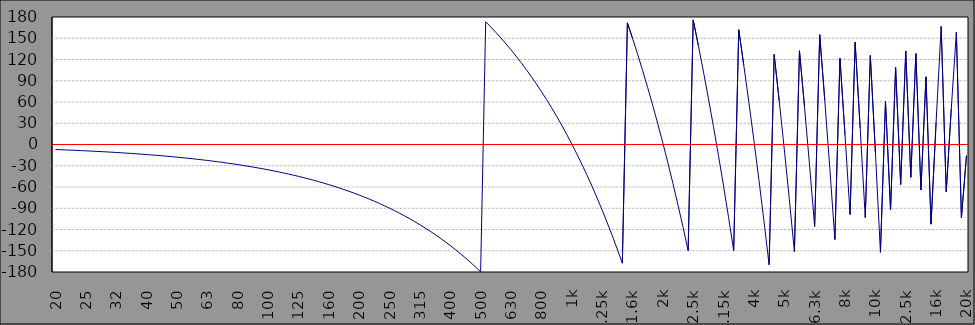
| Category | Series 0 |
|---|---|
| 20 | -7.1 |
| 20.78431373 | -7.378 |
| 21.59938485 | -7.668 |
| 22.44641955 | -7.969 |
| 23.3266713 | -8.281 |
| 24.24144272 | -8.606 |
| 25 | -8.943 |
| 26.18001254 | -9.294 |
| 27.2066797 | -9.658 |
| 28.27360831 | -10.037 |
| 29.38237726 | -10.431 |
| 30.53462735 | -10.84 |
| 31.5 | -11.265 |
| 32.97645838 | -11.707 |
| 34.26965282 | -12.166 |
| 35.61356077 | -12.643 |
| 37.010171 | -13.139 |
| 38.46155026 | -13.654 |
| 40 | -14.189 |
| 41.5372913 | -14.746 |
| 43.16620468 | -15.324 |
| 44.85899702 | -15.925 |
| 46.61817338 | -16.55 |
| 48.44633704 | -17.199 |
| 50 | -17.873 |
| 52.32055392 | -18.574 |
| 54.37234035 | -19.302 |
| 56.50458899 | -20.059 |
| 58.72045522 | -20.846 |
| 61.02321817 | -21.663 |
| 63 | -22.513 |
| 65.90319871 | -23.396 |
| 68.48763788 | -24.313 |
| 71.1734276 | -25.267 |
| 73.96454241 | -26.258 |
| 76.8651127 | -27.287 |
| 80 | -28.357 |
| 83.01195754 | -29.469 |
| 86.26732843 | -30.625 |
| 89.65036091 | -31.826 |
| 93.16606134 | -33.074 |
| 96.81963237 | -34.371 |
| 100 | -35.719 |
| 104.562225 | -37.12 |
| 108.6627045 | -38.576 |
| 112.923987 | -40.088 |
| 117.3523786 | -41.66 |
| 121.9544327 | -43.294 |
| 125 | -44.992 |
| 131.7070363 | -46.756 |
| 136.8720181 | -48.59 |
| 142.2395482 | -50.495 |
| 147.8175697 | -52.476 |
| 153.6143372 | -54.533 |
| 160 | -56.672 |
| 165.8987594 | -58.894 |
| 172.4045931 | -61.204 |
| 179.1655575 | -63.604 |
| 186.1916578 | -66.098 |
| 193.4932915 | -68.691 |
| 200 | -71.384 |
| 208.9668034 | -74.184 |
| 217.16158 | -77.093 |
| 225.6777204 | -80.116 |
| 234.5278271 | -83.258 |
| 243.7249968 | -86.523 |
| 250 | -89.916 |
| 263.2155002 | -93.442 |
| 273.5376767 | -97.107 |
| 284.2646444 | -100.915 |
| 295.4122775 | -104.872 |
| 306.9970727 | -108.985 |
| 315 | -113.259 |
| 331.5473961 | -117.7 |
| 344.5492547 | -122.316 |
| 358.0609902 | -127.112 |
| 372.1025977 | -132.097 |
| 386.6948564 | -137.278 |
| 400 | -142.661 |
| 417.6185512 | -148.256 |
| 433.9957493 | -154.07 |
| 451.0151904 | -160.111 |
| 468.7020606 | -166.39 |
| 487.0825336 | -172.915 |
| 500 | -179.696 |
| 526.0341549 | 173.257 |
| 546.6629453 | 165.933 |
| 568.1007079 | 158.323 |
| 590.379167 | 150.414 |
| 613.5312912 | 142.195 |
| 630 | 133.654 |
| 662.5949239 | 124.777 |
| 688.5790385 | 115.553 |
| 715.5821381 | 105.967 |
| 743.6441827 | 96.005 |
| 772.8066997 | 85.652 |
| 800 | 74.893 |
| 834.6074661 | 63.712 |
| 867.3371707 | 52.093 |
| 901.350393 | 40.018 |
| 936.6974673 | 27.47 |
| 973.4307013 | 14.43 |
| 1k | 0.878 |
| 1051.275217 | -13.205 |
| 1092.501696 | -27.841 |
| 1135.3449 | -43.05 |
| 1179.868229 | -58.856 |
| 1226.137572 | -75.282 |
| 1.25k | -92.352 |
| 1324.190865 | -110.091 |
| 1376.119918 | -128.526 |
| 1430.085405 | -147.684 |
| 1486.167186 | -167.593 |
| 1544.448252 | 171.717 |
| 1.6k | 150.216 |
| 1667.956609 | 127.871 |
| 1733.366672 | 104.651 |
| 1801.341836 | 80.519 |
| 1871.982692 | 55.442 |
| 1945.393778 | 29.381 |
| 2k | 2.298 |
| 2100.965445 | -25.848 |
| 2183.356247 | -55.097 |
| 2268.97806 | -85.493 |
| 2357.957592 | -117.08 |
| 2450.426517 | -149.907 |
| 2.5k | 175.979 |
| 2646.38527 | 140.527 |
| 2750.165084 | 103.685 |
| 2858.014695 | 65.398 |
| 2970.093703 | 25.61 |
| 3086.567966 | -15.739 |
| 3.15k | -58.709 |
| 3333.398468 | -103.364 |
| 3464.119977 | -149.771 |
| 3599.967819 | 162.003 |
| 3741.143028 | 111.885 |
| 3887.854519 | 59.802 |
| 4k | 5.677 |
| 4198.7633 | -50.571 |
| 4363.420685 | -109.025 |
| 4534.535221 | -169.771 |
| 4712.360132 | 127.101 |
| 4897.158569 | 61.497 |
| 5k | -6.679 |
| 5288.78063 | -77.53 |
| 5496.183792 | -151.158 |
| 5711.720411 | 132.326 |
| 5935.709447 | 52.809 |
| 6168.482367 | -29.826 |
| 6.3k | -115.701 |
| 6661.771229 | 155.056 |
| 6923.01716 | 62.313 |
| 7194.508029 | -34.067 |
| 7476.645599 | -134.227 |
| 7769.847387 | 121.686 |
| 8k | 13.517 |
| 8391.196198 | -98.894 |
| 8720.262715 | 144.286 |
| 9062.233802 | 22.886 |
| 9417.61552 | -103.276 |
| 9786.933776 | 125.615 |
| 10k | -10.635 |
| 10569.58746 | -152.228 |
| 10984.08108 | 60.625 |
| 11414.82936 | -92.291 |
| 11862.46973 | 108.795 |
| 12327.66462 | -56.35 |
| 12.5k | 132.028 |
| 13313.49862 | -46.323 |
| 13835.59661 | 128.331 |
| 14378.16902 | -64.284 |
| 14942.01879 | 95.548 |
| 15527.98031 | -112.47 |
| 16k | 31.355 |
| 16769.74113 | 166.702 |
| 17427.37804 | -66.76 |
| 18110.80463 | 50.622 |
| 18821.03226 | 158.489 |
| 19559.11196 | -103.531 |
| 20k | -15.826 |